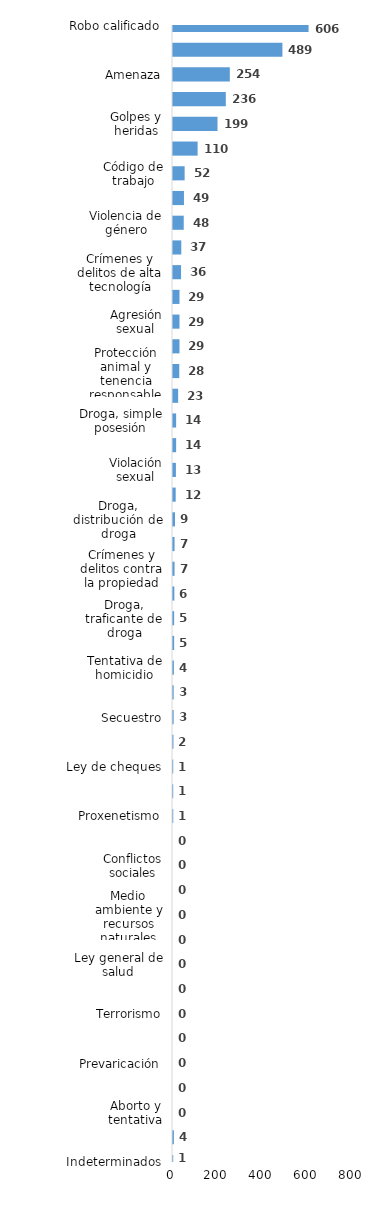
| Category | Series 0 |
|---|---|
| Robo calificado | 606 |
| Violencia intrafamiliar | 489 |
| Amenaza | 254 |
| Código del menor NNA | 236 |
| Golpes y heridas | 199 |
| Daños y perjuicios a la cosa ajena | 110 |
| Código de trabajo | 52 |
| Asociación de malhechores | 49 |
| Violencia de género | 48 |
| Abuso de confianza | 37 |
| Crímenes y delitos de alta tecnología | 36 |
| Estafa | 29 |
| Agresión sexual | 29 |
| Tránsito y seguridad vial  | 29 |
| Protección animal y tenencia responsable | 28 |
| Ley de armas | 23 |
| Droga, simple posesión | 14 |
| Droga, sanciones y circunstancias agravantes | 14 |
| Violación sexual | 13 |
| Robo simple | 12 |
| Droga, distribución de droga | 9 |
| Homicidio | 7 |
| Crímenes y delitos contra la propiedad | 7 |
| Desaparición | 6 |
| Droga, traficante de droga | 5 |
| Propiedad industrial, intelectual y derecho de autor | 5 |
| Tentativa de homicidio | 4 |
| Difamación e injuria | 3 |
| Secuestro | 3 |
| Falsificación | 2 |
| Ley de cheques | 1 |
| Derechos humanos | 1 |
| Proxenetismo | 1 |
| Pérdida de documento de identidad | 0 |
| Conflictos sociales | 0 |
| Tráfico ilícito de migrantes y trata de personas | 0 |
| Medio ambiente y recursos naturales | 0 |
| Contra el lavado de activos  | 0 |
| Ley general de salud | 0 |
| Juegos de azar | 0 |
| Terrorismo | 0 |
| Soborno | 0 |
| Prevaricación | 0 |
| Droga, delitos y sanciones | 0 |
| Aborto y tentativa | 0 |
| Otros | 4 |
| Indeterminados | 1 |